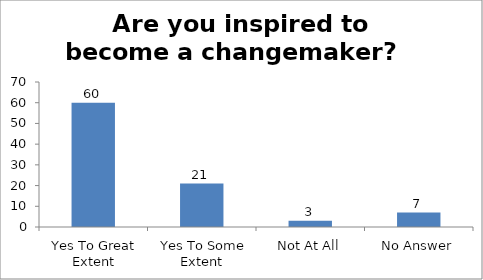
| Category | Are you inspired to become a changemaker?   |
|---|---|
| Yes To Great Extent | 60 |
|  Yes To Some Extent | 21 |
| Not At All | 3 |
| No Answer | 7 |